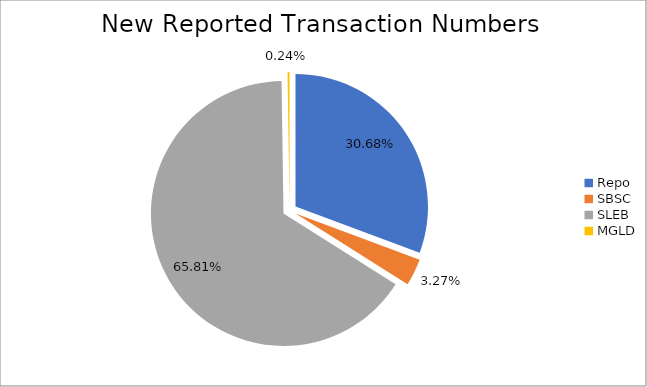
| Category | Series 0 |
|---|---|
| Repo | 409727 |
| SBSC | 43731 |
| SLEB | 878809 |
| MGLD | 3144 |